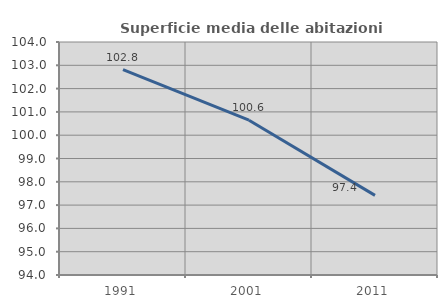
| Category | Superficie media delle abitazioni occupate |
|---|---|
| 1991.0 | 102.815 |
| 2001.0 | 100.644 |
| 2011.0 | 97.417 |